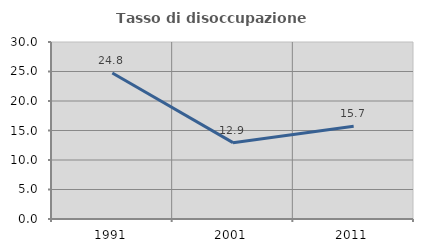
| Category | Tasso di disoccupazione giovanile  |
|---|---|
| 1991.0 | 24.752 |
| 2001.0 | 12.941 |
| 2011.0 | 15.714 |